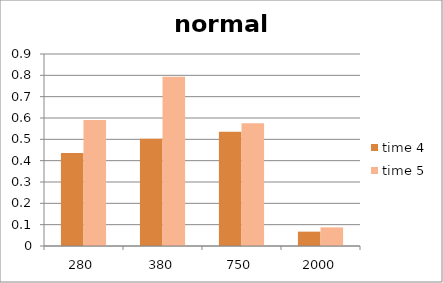
| Category | time 4 | time 5 |
|---|---|---|
| 280.0 | 0.436 | 0.591 |
| 380.0 | 0.503 | 0.793 |
| 750.0 | 0.536 | 0.575 |
| 2000.0 | 0.067 | 0.087 |